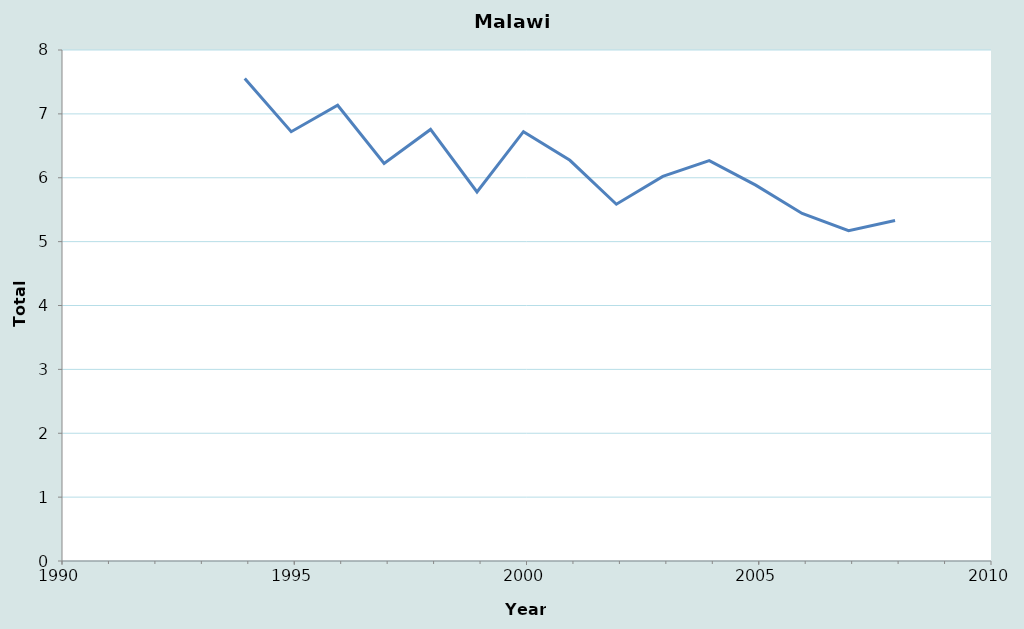
| Category | Series 0 |
|---|---|
| 2007.9344262295083 | 5.331 |
| 2006.9344262295083 | 5.172 |
| 2005.9344262295083 | 5.44 |
| 2004.9344262295083 | 5.884 |
| 2003.9344262295083 | 6.268 |
| 2002.9344262295083 | 6.021 |
| 2001.9344262295083 | 5.586 |
| 2000.9344262295083 | 6.273 |
| 1999.9344262295083 | 6.721 |
| 1998.9344262295083 | 5.778 |
| 1997.9344262295083 | 6.756 |
| 1996.9344262295083 | 6.226 |
| 1995.9344262295083 | 7.135 |
| 1994.9344262295083 | 6.721 |
| 1993.9344262295083 | 7.555 |